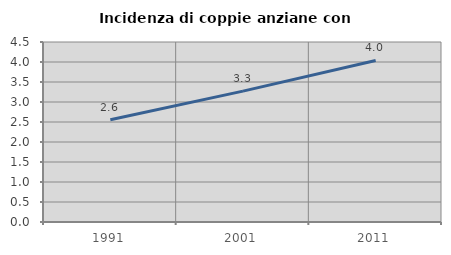
| Category | Incidenza di coppie anziane con figli |
|---|---|
| 1991.0 | 2.556 |
| 2001.0 | 3.272 |
| 2011.0 | 4.038 |